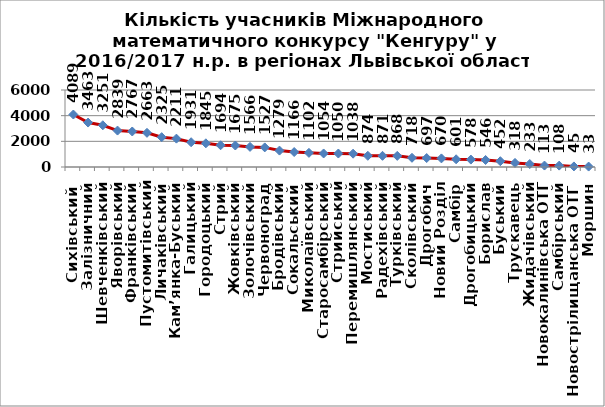
| Category | 2016/2017 н.р. |
|---|---|
| Сихівський  | 4089 |
| Залізничний | 3463 |
| Шевченківський | 3251 |
| Яворівський | 2839 |
| Франківський | 2767 |
| Пустомитівський | 2663 |
| Личаківський | 2325 |
| Кам’янка-Буський | 2211 |
| Галицький | 1931 |
| Городоцький | 1845 |
| Стрий | 1694 |
| Жовківський | 1675 |
| Золочівський | 1566 |
| Червоноград | 1527 |
| Бродівський | 1279 |
| Сокальський | 1166 |
| Миколаївський | 1102 |
| Старосамбірський | 1054 |
| Стрийський | 1050 |
| Перемишлянський | 1038 |
| Мостиський | 874 |
| Радехівський | 871 |
| Турківський | 868 |
| Сколівський | 718 |
| Дрогобич | 697 |
| Новий Розділ | 670 |
| Самбір | 601 |
| Дрогобицький | 578 |
| Борислав | 546 |
| Буський | 452 |
| Трускавець | 318 |
| Жидачівський | 233 |
| Новокалинівська ОТГ | 113 |
| Самбірський | 108 |
| Новострілищанська ОТГ  | 45 |
| Моршин | 33 |